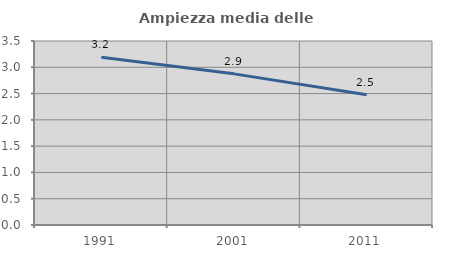
| Category | Ampiezza media delle famiglie |
|---|---|
| 1991.0 | 3.192 |
| 2001.0 | 2.875 |
| 2011.0 | 2.477 |